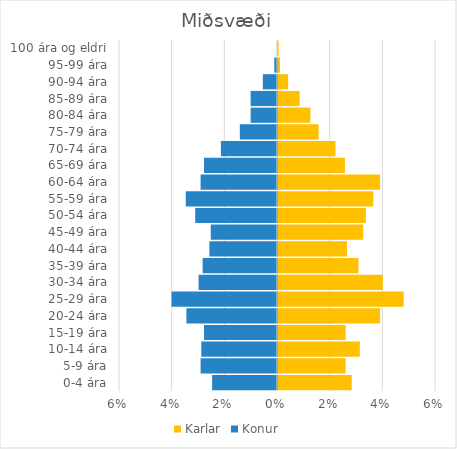
| Category | Karlar | Konur |
|---|---|---|
| 0-4 ára | 0.028 | -0.025 |
| 5-9 ára | 0.026 | -0.029 |
| 10-14 ára | 0.031 | -0.029 |
| 15-19 ára | 0.026 | -0.028 |
| 20-24 ára | 0.039 | -0.034 |
| 25-29 ára | 0.048 | -0.04 |
| 30-34 ára | 0.04 | -0.03 |
| 35-39 ára | 0.031 | -0.028 |
| 40-44 ára | 0.026 | -0.026 |
| 45-49 ára | 0.032 | -0.025 |
| 50-54 ára | 0.033 | -0.031 |
| 55-59 ára | 0.036 | -0.035 |
| 60-64 ára | 0.039 | -0.029 |
| 65-69 ára | 0.025 | -0.028 |
| 70-74 ára | 0.022 | -0.021 |
| 75-79 ára | 0.015 | -0.014 |
| 80-84 ára | 0.012 | -0.01 |
| 85-89 ára | 0.008 | -0.01 |
| 90-94 ára | 0.004 | -0.005 |
| 95-99 ára | 0.001 | -0.001 |
| 100 ára og eldri | 0 | 0 |